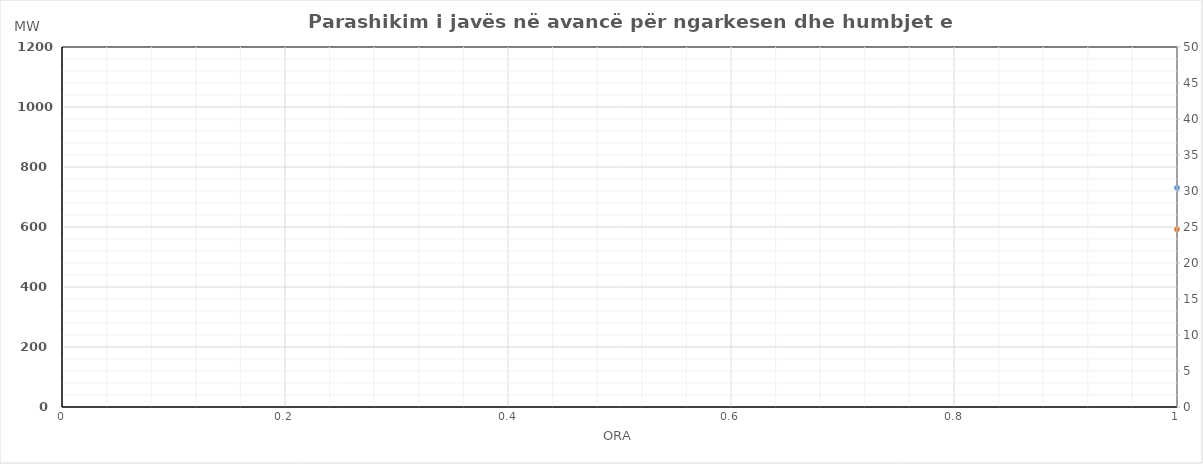
| Category | Ngarkesa (MWh) |
|---|---|
| 0 | 592.116 |
| 1 | 576.715 |
| 2 | 554.571 |
| 3 | 573.025 |
| 4 | 577.773 |
| 5 | 594.625 |
| 6 | 685.79 |
| 7 | 843.068 |
| 8 | 963.095 |
| 9 | 993.925 |
| 10 | 972.89 |
| 11 | 963.639 |
| 12 | 952.254 |
| 13 | 945.445 |
| 14 | 921.912 |
| 15 | 896.084 |
| 16 | 889.415 |
| 17 | 913.269 |
| 18 | 958.631 |
| 19 | 1015.604 |
| 20 | 1028.532 |
| 21 | 965.736 |
| 22 | 842.193 |
| 23 | 726.123 |
| 24 | 587.116 |
| 25 | 571.715 |
| 26 | 549.571 |
| 27 | 568.025 |
| 28 | 572.773 |
| 29 | 589.625 |
| 30 | 680.79 |
| 31 | 800 |
| 32 | 958.095 |
| 33 | 988.925 |
| 34 | 967.89 |
| 35 | 958.639 |
| 36 | 947.254 |
| 37 | 940.445 |
| 38 | 916.912 |
| 39 | 891.084 |
| 40 | 884.415 |
| 41 | 908.269 |
| 42 | 953.631 |
| 43 | 1010.604 |
| 44 | 1023.532 |
| 45 | 960.736 |
| 46 | 837.193 |
| 47 | 721.123 |
| 48 | 677.264 |
| 49 | 619.53 |
| 50 | 594.818 |
| 51 | 608.714 |
| 52 | 611.239 |
| 53 | 616.448 |
| 54 | 670.214 |
| 55 | 801.01 |
| 56 | 910.793 |
| 57 | 968.152 |
| 58 | 935.627 |
| 59 | 899.44 |
| 60 | 887.763 |
| 61 | 904.297 |
| 62 | 896.995 |
| 63 | 884.206 |
| 64 | 885.781 |
| 65 | 933.459 |
| 66 | 968.434 |
| 67 | 1025.835 |
| 68 | 1041.187 |
| 69 | 973.275 |
| 70 | 873.663 |
| 71 | 756.855 |
| 72 | 659.61 |
| 73 | 600.279 |
| 74 | 579.692 |
| 75 | 600.17 |
| 76 | 605.157 |
| 77 | 627.799 |
| 78 | 752.28 |
| 79 | 920.634 |
| 80 | 981.623 |
| 81 | 941.686 |
| 82 | 893.702 |
| 83 | 878.292 |
| 84 | 892.622 |
| 85 | 892.249 |
| 86 | 881.563 |
| 87 | 861.085 |
| 88 | 870.586 |
| 89 | 888.452 |
| 90 | 928.469 |
| 91 | 1008.886 |
| 92 | 1052.223 |
| 93 | 993.217 |
| 94 | 857.327 |
| 95 | 713.043 |
| 96 | 647.264 |
| 97 | 589.53 |
| 98 | 564.818 |
| 99 | 578.714 |
| 100 | 581.239 |
| 101 | 586.448 |
| 102 | 640.214 |
| 103 | 771.01 |
| 104 | 880.793 |
| 105 | 938.152 |
| 106 | 905.627 |
| 107 | 869.44 |
| 108 | 857.763 |
| 109 | 874.297 |
| 110 | 866.995 |
| 111 | 854.206 |
| 112 | 855.781 |
| 113 | 903.459 |
| 114 | 938.434 |
| 115 | 995.835 |
| 116 | 1011.187 |
| 117 | 943.275 |
| 118 | 843.663 |
| 119 | 726.855 |
| 120 | 634.61 |
| 121 | 575.279 |
| 122 | 554.692 |
| 123 | 575.17 |
| 124 | 580.157 |
| 125 | 602.799 |
| 126 | 727.28 |
| 127 | 895.634 |
| 128 | 956.623 |
| 129 | 916.686 |
| 130 | 868.702 |
| 131 | 853.292 |
| 132 | 867.622 |
| 133 | 867.249 |
| 134 | 856.563 |
| 135 | 836.085 |
| 136 | 845.586 |
| 137 | 863.452 |
| 138 | 903.469 |
| 139 | 983.886 |
| 140 | 1027.223 |
| 141 | 968.217 |
| 142 | 832.327 |
| 143 | 688.043 |
| 144 | 659.61 |
| 145 | 600.279 |
| 146 | 579.692 |
| 147 | 600.17 |
| 148 | 605.157 |
| 149 | 627.799 |
| 150 | 752.28 |
| 151 | 920.634 |
| 152 | 981.623 |
| 153 | 941.686 |
| 154 | 893.702 |
| 155 | 878.292 |
| 156 | 892.622 |
| 157 | 892.249 |
| 158 | 881.563 |
| 159 | 861.085 |
| 160 | 870.586 |
| 161 | 888.452 |
| 162 | 928.469 |
| 163 | 1008.886 |
| 164 | 1052.223 |
| 165 | 993.217 |
| 166 | 857.327 |
| 167 | 713.043 |